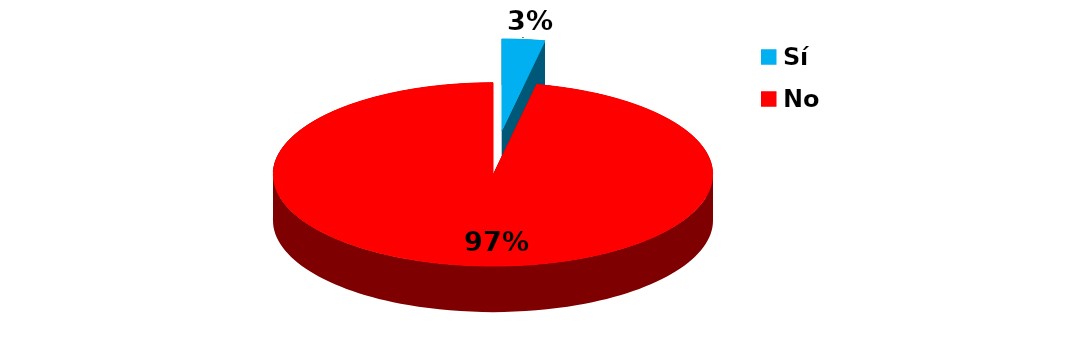
| Category | Series 0 |
|---|---|
| Sí | 4 |
| No | 123 |